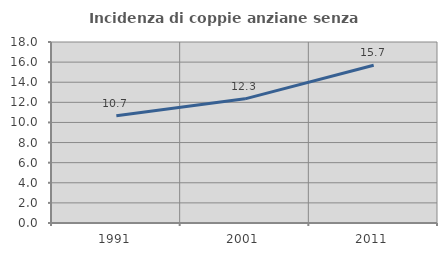
| Category | Incidenza di coppie anziane senza figli  |
|---|---|
| 1991.0 | 10.666 |
| 2001.0 | 12.346 |
| 2011.0 | 15.694 |